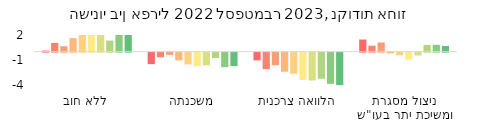
| Category | 1 | 2 | 3 | 4 | 5 | 6 | 7 | 8 | 9 | 10 |
|---|---|---|---|---|---|---|---|---|---|---|
| ללא חוב | 0.13 | 1.053 | 0.651 | 1.623 | 2.056 | 2.816 | 2.524 | 1.331 | 2.128 | 2.197 |
| משכנתה | -1.375 | -0.552 | -0.265 | -0.925 | -1.411 | -1.627 | -1.52 | -0.651 | -1.741 | -1.612 |
| הלוואה צרכנית | -0.922 | -1.965 | -1.5 | -2.283 | -2.544 | -3.256 | -3.344 | -3.127 | -3.74 | -3.997 |
| ניצול מסגרת ומשיכת יתר בעו"ש | 1.458 | 0.717 | 1.102 | -0.082 | -0.32 | -0.837 | -0.34 | 0.808 | 0.826 | 0.684 |